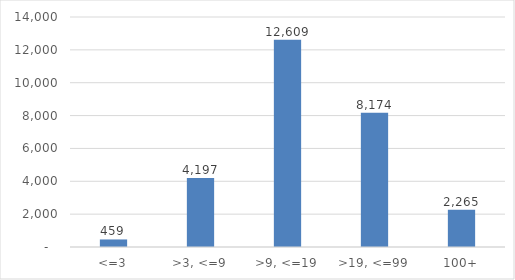
| Category |  Employees (000s)  |
|---|---|
| <=3 | 459.4 |
| >3, <=9 | 4196.9 |
| >9, <=19 | 12609 |
| >19, <=99 | 8174.2 |
| 100+ | 2265 |